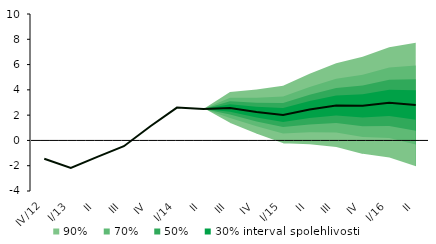
| Category | Centerline |
|---|---|
| IV/12 | -1.447 |
| I/13 | -2.167 |
| II | -1.306 |
| III | -0.459 |
| IV | 1.121 |
| I/14 | 2.596 |
| II | 2.479 |
| III | 2.566 |
| IV | 2.244 |
| I/15 | 2.009 |
| II | 2.441 |
| III | 2.761 |
| IV | 2.734 |
| I/16 | 2.972 |
| II | 2.804 |